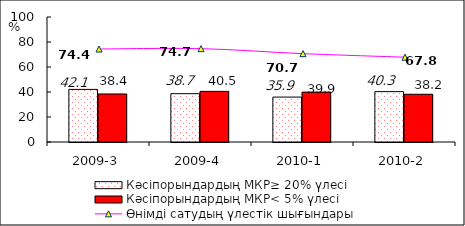
| Category | Кәсіпорындардың МКР≥ 20% үлесі | Кәсіпорындардың МКР< 5% үлесі |
|---|---|---|
| 2009-3 | 42.075 | 38.426 |
| 2009-4 | 38.657 | 40.509 |
| 2010-1 | 35.938 | 39.911 |
| 2010-2 | 40.307 | 38.184 |